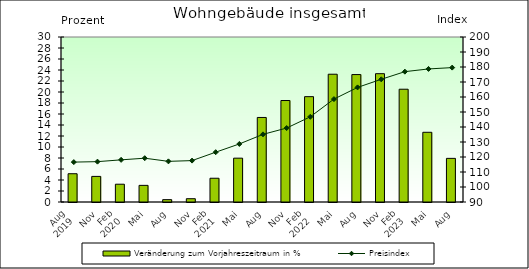
| Category | Veränderung zum Vorjahreszeitraum in % |
|---|---|
| 0 | 5.14 |
| 1 | 4.655 |
| 2 | 3.234 |
| 3 | 3.025 |
| 4 | 0.429 |
| 5 | 0.599 |
| 6 | 4.318 |
| 7 | 7.97 |
| 8 | 15.371 |
| 9 | 18.452 |
| 10 | 19.156 |
| 11 | 23.232 |
| 12 | 23.168 |
| 13 | 23.331 |
| 14 | 20.504 |
| 15 | 12.673 |
| 16 | 7.933 |